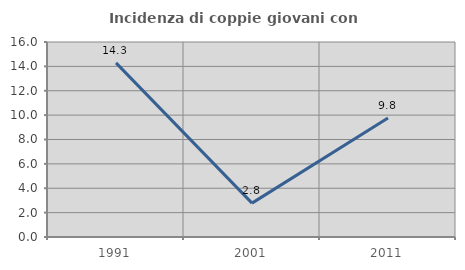
| Category | Incidenza di coppie giovani con figli |
|---|---|
| 1991.0 | 14.286 |
| 2001.0 | 2.778 |
| 2011.0 | 9.756 |